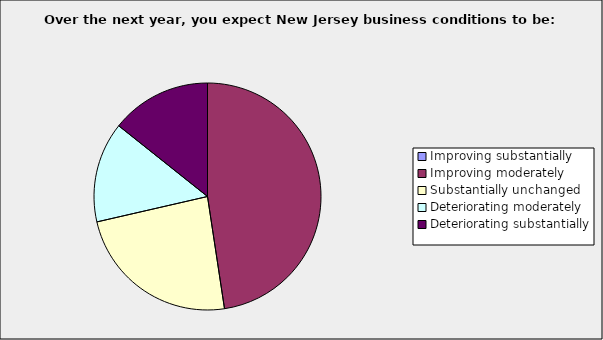
| Category | Series 0 |
|---|---|
| Improving substantially | 0 |
| Improving moderately | 0.476 |
| Substantially unchanged | 0.238 |
| Deteriorating moderately | 0.143 |
| Deteriorating substantially | 0.143 |